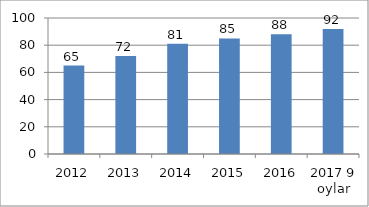
| Category | Series 0 |
|---|---|
| 2012 | 65 |
| 2013 | 72 |
| 2014 | 81 |
| 2015 | 85 |
| 2016 | 88 |
| 2017 9 oylar | 92 |